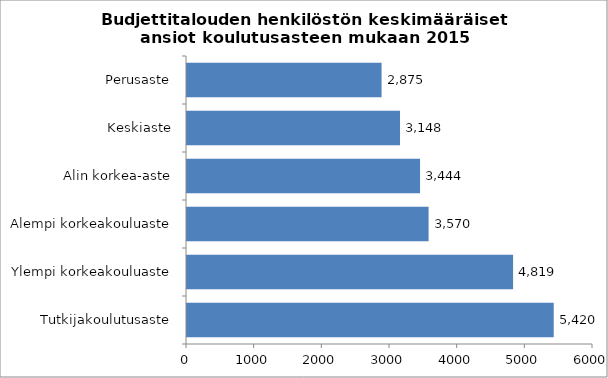
| Category | Series 0 |
|---|---|
| Tutkijakoulutusaste | 5419.674 |
| Ylempi korkeakouluaste | 4818.967 |
| Alempi korkeakouluaste | 3570.206 |
| Alin korkea-aste | 3444.095 |
| Keskiaste | 3148.031 |
| Perusaste | 2875.457 |